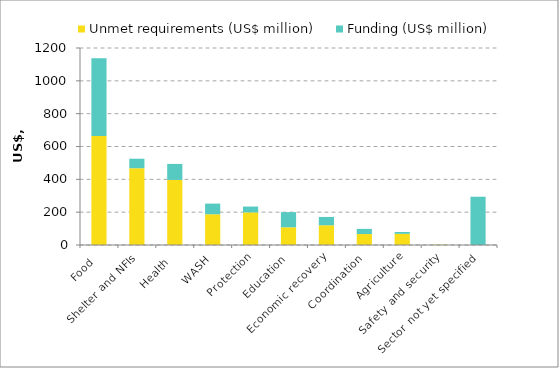
| Category | Unmet requirements (US$ million)
 | Funding (US$ million)
 |
|---|---|---|
| Food  | 663.749 | 473.585 |
| Shelter and NFIs | 467.765 | 57.735 |
| Health  | 396.276 | 97.516 |
| WASH | 187.321 | 64.727 |
| Protection | 198.608 | 35.594 |
| Education  | 107.937 | 92.303 |
| Economic recovery | 120.172 | 50.737 |
| Coordination | 66.77 | 31.418 |
| Agriculture | 68.231 | 10.915 |
| Safety and security | 1.913 | 0.399 |
| Sector not yet specified  | 0 | 294.029 |